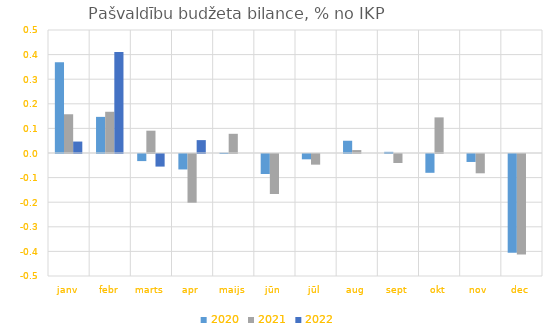
| Category | 2020 | 2021 | 2022 |
|---|---|---|---|
| janv | 0.369 | 0.157 | 0.047 |
| febr | 0.147 | 0.168 | 0.411 |
| marts | -0.029 | 0.091 | -0.051 |
| apr | -0.063 | -0.198 | 0.052 |
| maijs | 0.001 | 0.078 | 0 |
| jūn | -0.081 | -0.163 | 0 |
| jūl | -0.022 | -0.043 | 0 |
| aug | 0.05 | 0.012 | 0 |
| sept | 0.005 | -0.037 | 0 |
| okt | -0.076 | 0.145 | 0 |
| nov | -0.032 | -0.078 | 0 |
| dec | -0.401 | -0.408 | 0 |